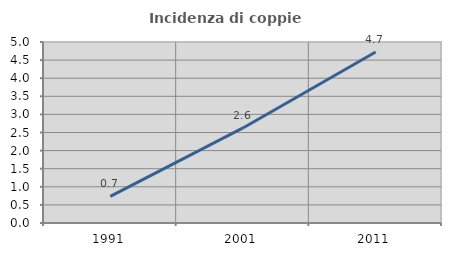
| Category | Incidenza di coppie miste |
|---|---|
| 1991.0 | 0.737 |
| 2001.0 | 2.625 |
| 2011.0 | 4.724 |